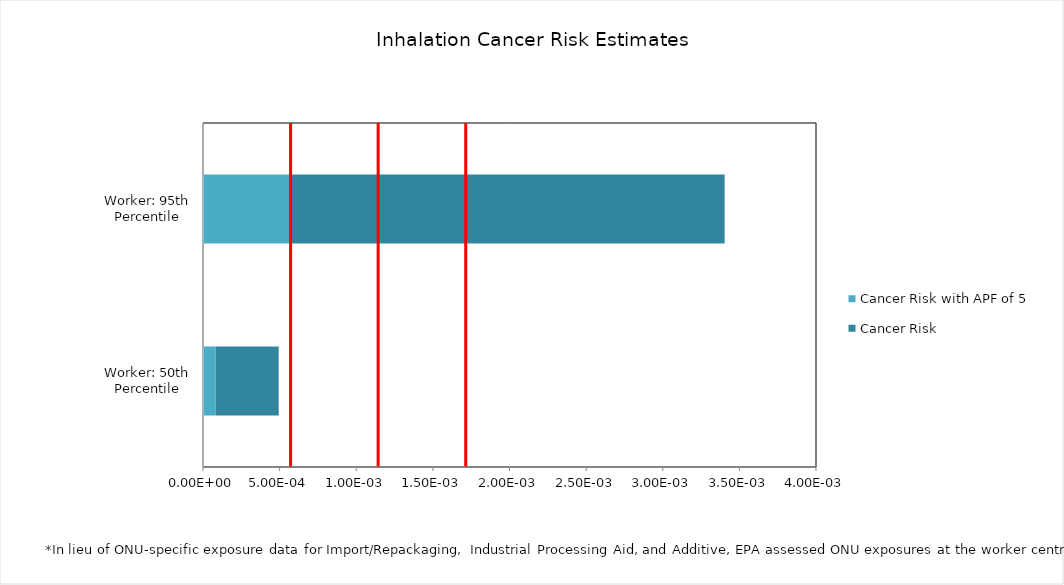
| Category | Cancer Risk with APF of 5 | Cancer Risk |
|---|---|---|
| Worker: 50th Percentile | 0 | 0 |
| Worker: 95th Percentile | 0.001 | 0.003 |